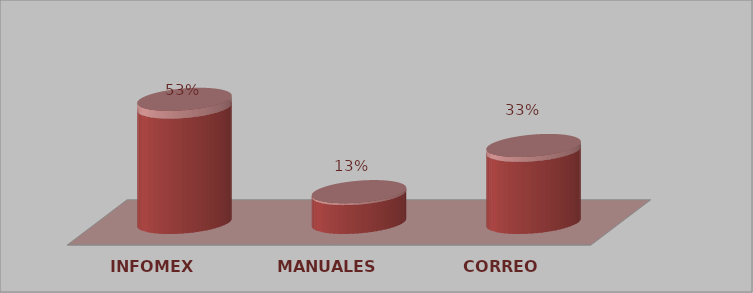
| Category | Series 0 | Series 1 |
|---|---|---|
| INFOMEX | 8 | 0.533 |
| MANUALES | 2 | 0.133 |
| CORREO | 5 | 0.333 |